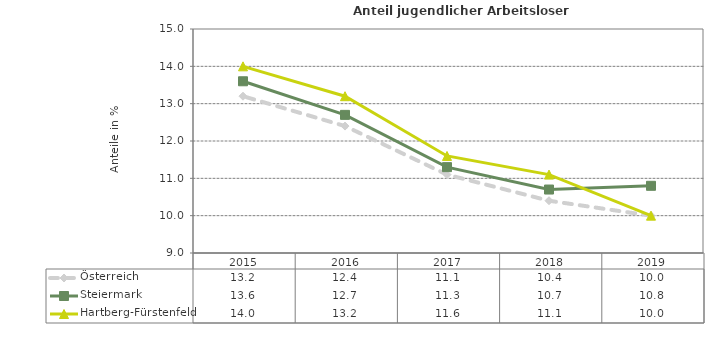
| Category | Österreich | Steiermark | Hartberg-Fürstenfeld |
|---|---|---|---|
| 2019.0 | 10 | 10.8 | 10 |
| 2018.0 | 10.4 | 10.7 | 11.1 |
| 2017.0 | 11.1 | 11.3 | 11.6 |
| 2016.0 | 12.4 | 12.7 | 13.2 |
| 2015.0 | 13.2 | 13.6 | 14 |